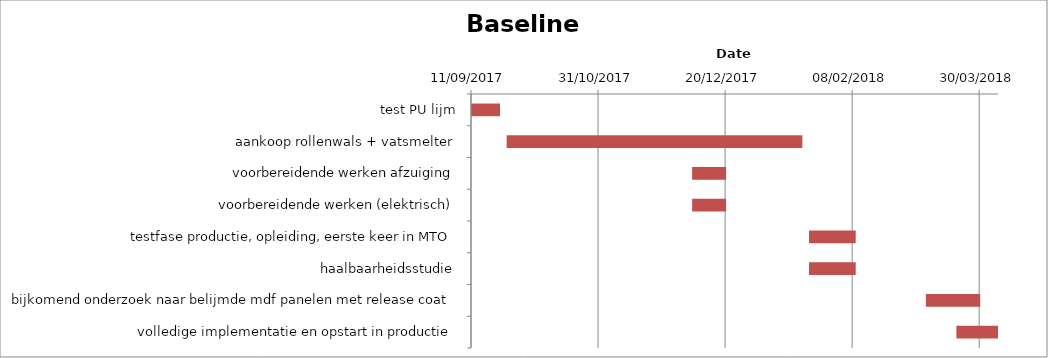
| Category | Baseline start | Actual duration |
|---|---|---|
| test PU lijm | 11/09/2017 | 11.375 |
| aankoop rollenwals + vatsmelter | 25/09/2017 | 116.375 |
| voorbereidende werken afzuiging | 07/12/2017 | 13.375 |
| voorbereidende werken (elektrisch) | 07/12/2017 | 13.375 |
| testfase productie, opleiding, eerste keer in MTO | 22/01/2018 | 18.375 |
| haalbaarheidsstudie | 22/01/2018 | 18.375 |
| bijkomend onderzoek naar belijmde mdf panelen met release coat | 09/03/2018 | 21.375 |
| volledige implementatie en opstart in productie | 21/03/2018 | 16.375 |